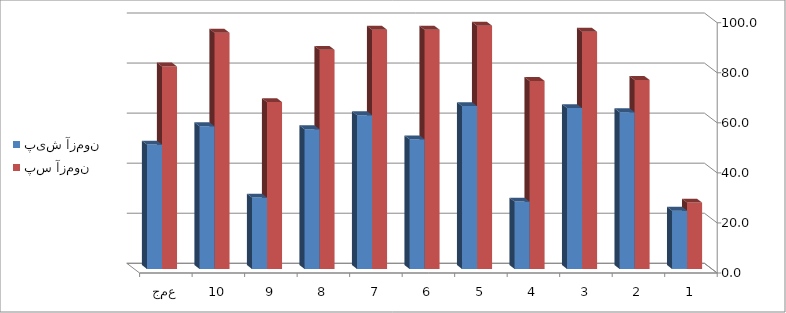
| Category | پیش آزمون | پس آزمون |
|---|---|---|
| 1 | 23.293 | 26.506 |
| 2 | 62.651 | 75.502 |
| 3 | 64.257 | 94.779 |
| 4 | 26.908 | 75.1 |
| 5 | 65.06 | 97.189 |
| 6 | 51.807 | 95.582 |
| 7 | 61.446 | 95.582 |
| 8 | 55.823 | 87.55 |
| 9 | 28.514 | 66.667 |
| 10 | 57.028 | 94.378 |
| جمع | 49.679 | 80.884 |